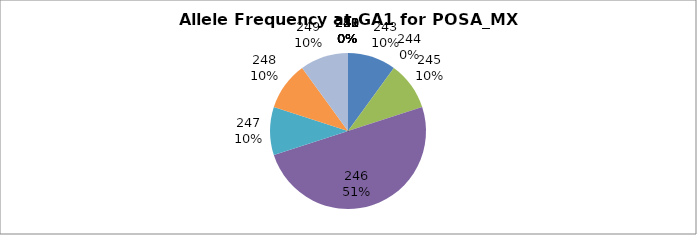
| Category | Series 0 |
|---|---|
| 221.0 | 0 |
| 238.0 | 0 |
| 239.0 | 0 |
| 240.0 | 0 |
| 241.0 | 0 |
| 242.0 | 0 |
| 243.0 | 0.1 |
| 244.0 | 0 |
| 245.0 | 0.1 |
| 246.0 | 0.5 |
| 247.0 | 0.1 |
| 248.0 | 0.1 |
| 249.0 | 0.1 |
| 250.0 | 0 |
| 251.0 | 0 |
| 253.0 | 0 |